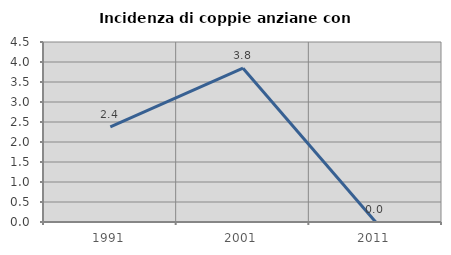
| Category | Incidenza di coppie anziane con figli |
|---|---|
| 1991.0 | 2.381 |
| 2001.0 | 3.846 |
| 2011.0 | 0 |